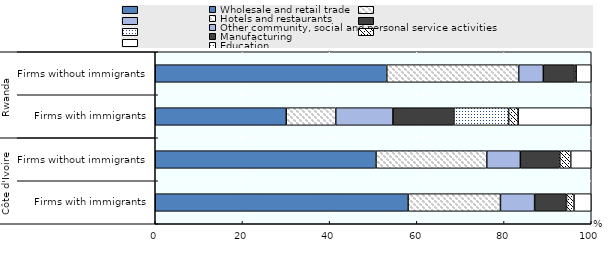
| Category | Wholesale and retail trade | Hotels and restaurants | Other community, social and personal service activities | Manufacturing | Education | Construction | Other |
|---|---|---|---|---|---|---|---|
| 0 | 57.993 | 21.179 | 7.836 | 7.318 | 0 | 1.725 | 3.949 |
| 1 | 50.631 | 25.41 | 7.697 | 9.052 | 0 | 2.511 | 4.699 |
| 2 | 30.03 | 11.37 | 13.12 | 13.99 | 12.54 | 2.19 | 16.76 |
| 3 | 53.1 | 30.26 | 5.65 | 7.17 | 0.27 | 0.09 | 3.46 |